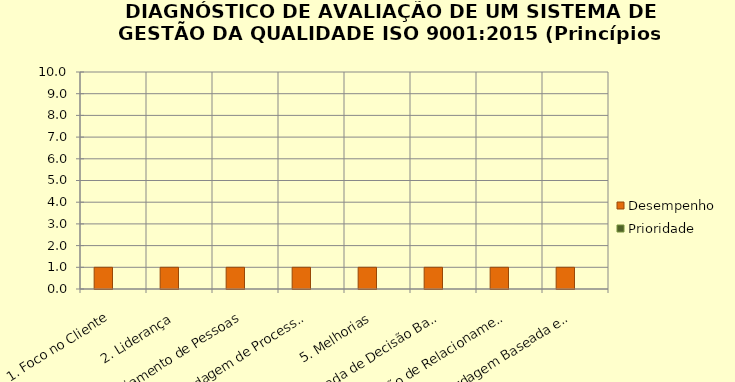
| Category | Desempenho | Prioridade |
|---|---|---|
| 1. Foco no Cliente | 1 | 0 |
| 2. Liderança | 1 | 0 |
| 3. Engajamento de Pessoas | 1 | 0 |
| 4. Abordagem de Processos | 1 | 0 |
| 5. Melhorias | 1 | 0 |
| 6. Tomada de Decisão Baseada em Evidência | 1 | 0 |
| 7. Gestão de Relacionamento | 1 | 0 |
| 8. Abordagem Baseada em Riscos | 1 | 0 |